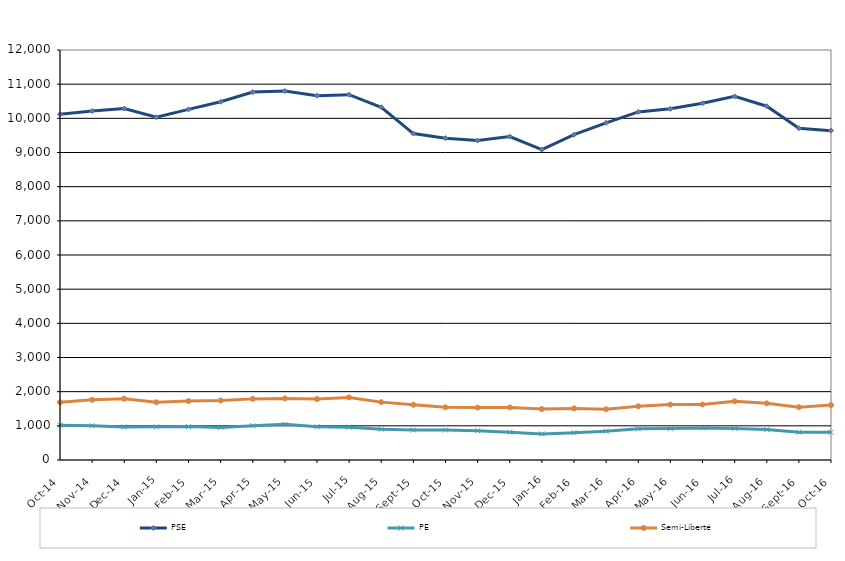
| Category | PSE | PE | Semi-Liberté |
|---|---|---|---|
| 2014-10-01 | 10120 | 1018 | 1692 |
| 2014-11-01 | 10213 | 1000 | 1760 |
| 2014-12-01 | 10287 | 966 | 1794 |
| 2015-01-01 | 10030 | 970 | 1689 |
| 2015-02-01 | 10261 | 977 | 1726 |
| 2015-03-01 | 10485 | 954 | 1742 |
| 2015-04-01 | 10770 | 1003 | 1789 |
| 2015-05-01 | 10801 | 1043 | 1803 |
| 2015-06-01 | 10662 | 973 | 1785 |
| 2015-07-01 | 10692 | 961 | 1832 |
| 2015-08-01 | 10325 | 903 | 1694 |
| 2015-09-01 | 9555 | 878 | 1616 |
| 2015-10-01 | 9420 | 877 | 1542 |
| 2015-11-01 | 9350 | 859 | 1533 |
| 2015-12-01 | 9466 | 815 | 1539 |
| 2016-01-01 | 9081 | 764 | 1490 |
| 2016-02-01 | 9521 | 798 | 1510 |
| 2016-03-01 | 9868 | 845 | 1486 |
| 2016-04-01 | 10187 | 912 | 1572 |
| 2016-05-01 | 10278 | 920 | 1621 |
| 2016-06-01 | 10441 | 939 | 1625 |
| 2016-07-01 | 10642 | 923 | 1718 |
| 2016-08-01 | 10355 | 890 | 1658 |
| 2016-09-01 | 9712 | 813 | 1546 |
| 2016-10-01 | 9640 | 809 | 1607 |